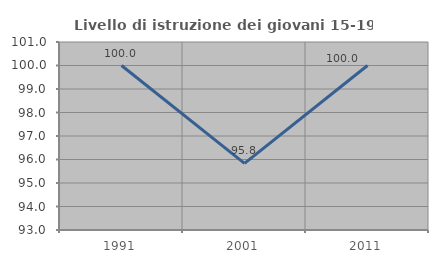
| Category | Livello di istruzione dei giovani 15-19 anni |
|---|---|
| 1991.0 | 100 |
| 2001.0 | 95.833 |
| 2011.0 | 100 |